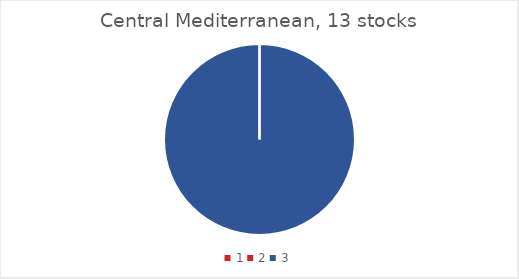
| Category | Central Med. |
|---|---|
| 0 | 0 |
| 1 | 0 |
| 2 | 13 |